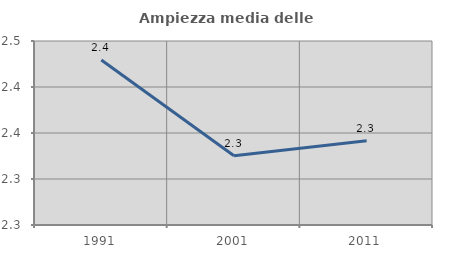
| Category | Ampiezza media delle famiglie |
|---|---|
| 1991.0 | 2.429 |
| 2001.0 | 2.325 |
| 2011.0 | 2.342 |